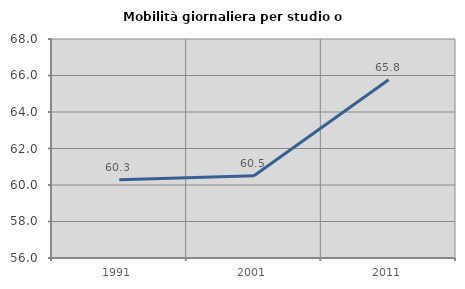
| Category | Mobilità giornaliera per studio o lavoro |
|---|---|
| 1991.0 | 60.29 |
| 2001.0 | 60.502 |
| 2011.0 | 65.765 |